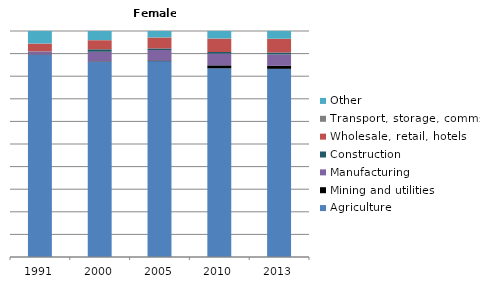
| Category | Agriculture | Mining and utilities | Manufacturing | Construction | Wholesale, retail, hotels | Transport, storage, comms | Other |
|---|---|---|---|---|---|---|---|
| 1991.0 | 89.5 | 0.2 | 1.2 | 0.1 | 3.4 | 0.1 | 5.5 |
| 2000.0 | 86.5 | 0.2 | 4.2 | 1.1 | 4 | 0.1 | 4 |
| 2005.0 | 86.5 | 0.3 | 4.6 | 0.7 | 4.8 | 0.1 | 2.8 |
| 2010.0 | 83.5 | 1.3 | 5.2 | 0.7 | 5.9 | 0.1 | 3.3 |
| 2013.0 | 83.1 | 1.3 | 5.1 | 0.8 | 6 | 0.1 | 3.4 |